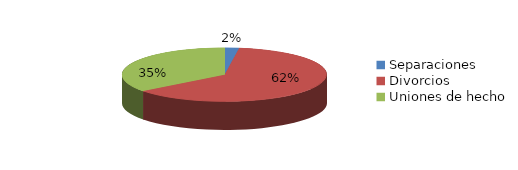
| Category | Series 0 |
|---|---|
| Separaciones | 24 |
| Divorcios | 659 |
| Uniones de hecho | 375 |